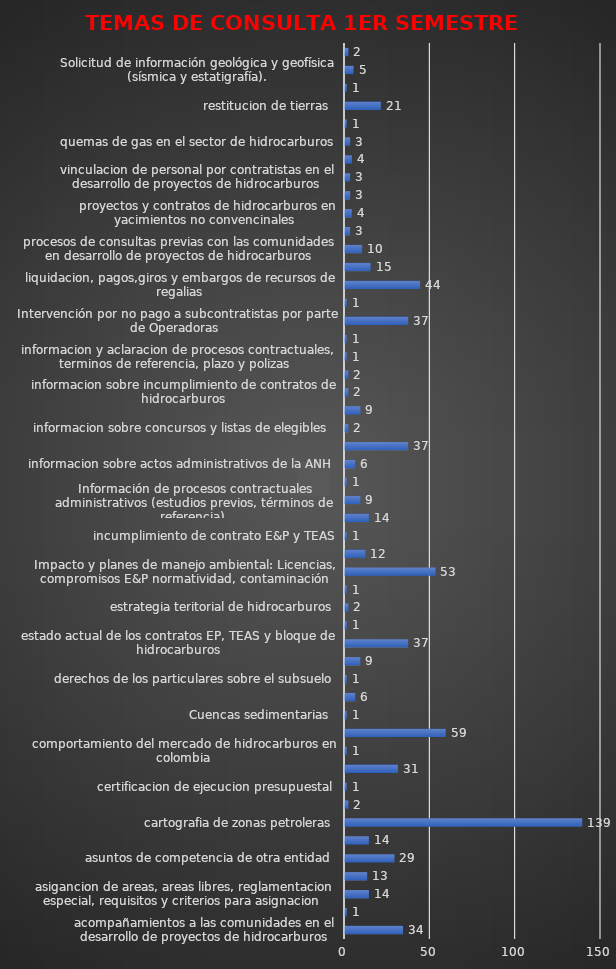
| Category | Series 0 |
|---|---|
| acompañamientos a las comunidades en el desarrollo de proyectos de hidrocarburos | 34 |
| Actividad Hidrocarburífera en regiones del país | 1 |
| asigancion de areas, areas libres, reglamentacion especial, requisitos y criterios para asignacion  | 14 |
| areas protegidas, reservas naturales,humedales y oarques nacionales naturales | 13 |
| asuntos de competencia de otra entidad  | 29 |
| beneficio de poblacion y sus comunidades por actividad petrolera  | 14 |
| cartografia de zonas petroleras | 139 |
| certificacion laboral  | 2 |
| certificacion de ejecucion presupuestal | 1 |
| cifras oficiales de produccion en el pais  | 31 |
| comportamiento del mercado de hidrocarburos en colombia | 1 |
| Copias de contratos (E&P, TEAS y Administrativos) | 59 |
| Cuencas sedimentarias  | 1 |
| datos de sismica y pozos | 6 |
| derechos de los particulares sobre el subsuelo | 1 |
| estado actual de los pozos | 9 |
| estado actual de los contratos EP, TEAS y bloque de hidrocarburos | 37 |
| Existencia yacimiento de Petróleo | 1 |
| estrategia teritorial de hidrocarburos | 2 |
| FAEP montos girados  | 1 |
| Impacto y planes de manejo ambiental: Licencias, compromisos E&P normatividad, contaminación | 53 |
| Inconformidad por desarrollo irregular de proyecto | 12 |
| incumplimiento de contrato E&P y TEAS | 1 |
| informacion de operadores en colombia  | 14 |
| Información de procesos contractuales administrativos (estudios previos, términos de referencia)  | 9 |
| informacion formato shapefile acerca de las reservas naturales, humedales y comunidades | 1 |
| informacion sobre actos administrativos de la ANH | 6 |
| informacion sobre proyectos de perforacion y profundidad  | 37 |
| informacion sobre concursos y listas de elegibles  | 2 |
| informacion presupuestal y plan anual de adquisiciones de la entidad  | 9 |
| informacion sobre incumplimiento de contratos de hidrocarburos | 2 |
| informacion sobre proyectos y contratos offshore | 2 |
| informacion y aclaracion de procesos contractuales, terminos de referencia, plazo y polizas  | 1 |
| Informes sobres Consultas previas  | 1 |
| Intervención por no pago a subcontratistas por parte de Operadoras  | 37 |
| inversion social | 1 |
| liquidacion, pagos,giros y embargos de recursos de regalias | 44 |
| normatividad sobre exploracion, regulacion y produccion de hidrocarburos | 15 |
| procesos de consultas previas con las comunidades en desarrollo de proyectos de hidrocarburos | 10 |
| Procesos de servidumbres petroleras  | 3 |
| proyectos y contratos de hidrocarburos en yacimientos no convencinales  | 4 |
| proyectos de interes nacional y estrategico | 3 |
| vinculacion de personal por contratistas en el desarrollo de proyectos de hidrocarburos  | 3 |
| reservas de hidrocarburos en el pais  | 4 |
| quemas de gas en el sector de hidrocarburos | 3 |
| requerimientos congreso d ela republica  | 1 |
| restitucion de tierras  | 21 |
| requerimientos de entes de control en el marco de auditoria e investigaciones especiales | 1 |
| Solicitud de información geológica y geofísica (sísmica y estatigrafía). | 5 |
| Temas tributarios en materia de hidrocarburos  | 2 |